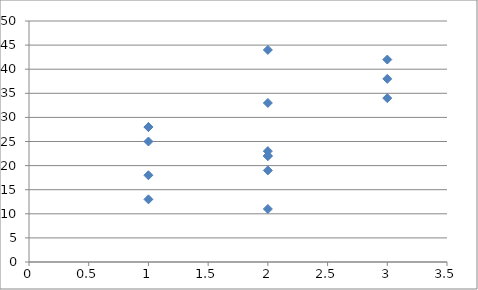
| Category | Series 0 |
|---|---|
| 1.0 | 18 |
| 2.0 | 22 |
| 1.0 | 28 |
| 3.0 | 38 |
| 2.0 | 22 |
| 1.0 | 28 |
| 2.0 | 19 |
| 2.0 | 11 |
| 2.0 | 23 |
| 1.0 | 13 |
| 2.0 | 33 |
| 2.0 | 44 |
| 3.0 | 42 |
| 3.0 | 34 |
| 1.0 | 25 |